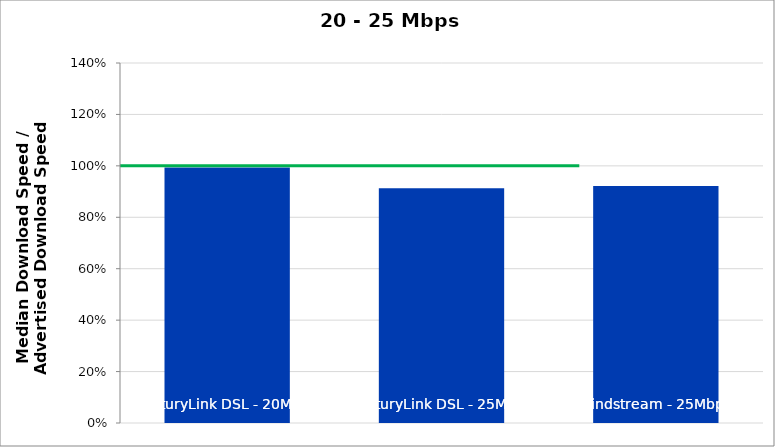
| Category | Series 0 |
|---|---|
| CenturyLink DSL - 20Mbps | 0.994 |
| CenturyLink DSL - 25Mbps | 0.913 |
| Windstream - 25Mbps | 0.921 |